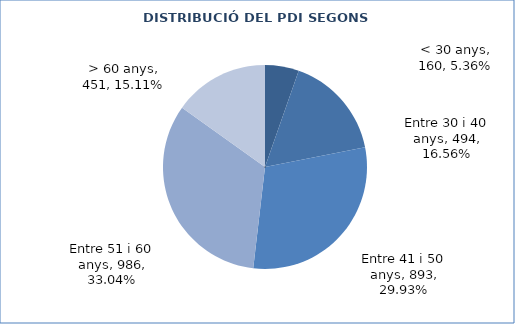
| Category | Series 0 |
|---|---|
| < 30 anys | 160 |
| Entre 30 i 40 anys | 494 |
| Entre 41 i 50 anys | 893 |
| Entre 51 i 60 anys | 986 |
| > 60 anys | 451 |